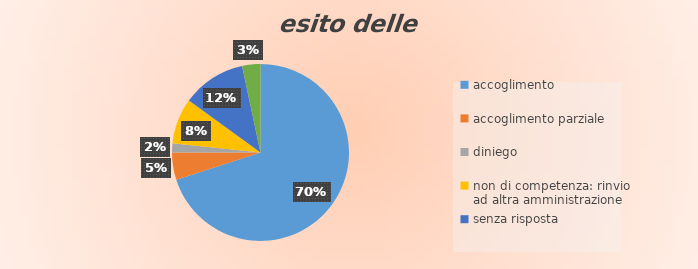
| Category | Series 0 |
|---|---|
| accoglimento | 42 |
| accoglimento parziale | 3 |
| diniego | 1 |
| non di competenza: rinvio ad altra amministrazione | 5 |
| senza risposta | 7 |
| termine per la risposta non ancora scaduto | 2 |